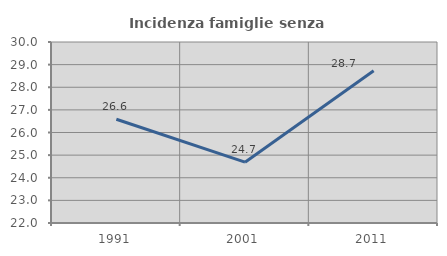
| Category | Incidenza famiglie senza nuclei |
|---|---|
| 1991.0 | 26.588 |
| 2001.0 | 24.688 |
| 2011.0 | 28.731 |